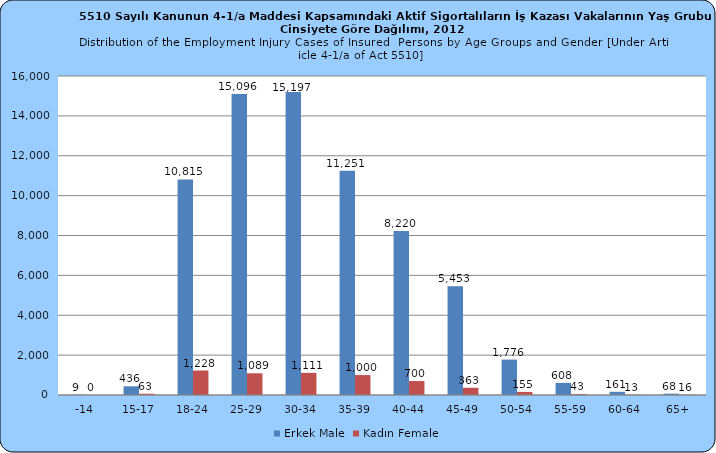
| Category | Erkek Male | Kadın Female |
|---|---|---|
| -14 | 9 | 0 |
| 15-17 | 436 | 63 |
| 18-24 | 10815 | 1228 |
| 25-29 | 15096 | 1089 |
| 30-34 | 15197 | 1111 |
| 35-39 | 11251 | 1000 |
| 40-44 | 8220 | 700 |
| 45-49 | 5453 | 363 |
| 50-54 | 1776 | 155 |
| 55-59 | 608 | 43 |
| 60-64 | 161 | 13 |
| 65+ | 68 | 16 |